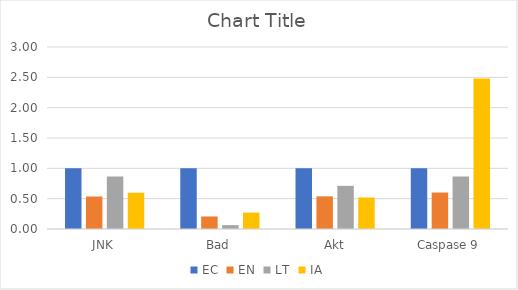
| Category | EC | EN | LT | IA |
|---|---|---|---|---|
| JNK | 1 | 0.536 | 0.866 | 0.598 |
| Bad | 1 | 0.207 | 0.064 | 0.271 |
| Akt | 1 | 0.538 | 0.712 | 0.519 |
| Caspase 9 | 1 | 0.601 | 0.865 | 2.48 |